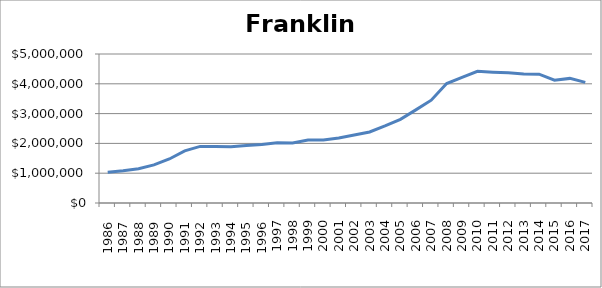
| Category | Franklin (000s) |
|---|---|
|       1986 | 1034600 |
|       1987 | 1079500 |
|       1988 | 1147600 |
|       1989 | 1278150 |
|       1990 | 1476950 |
|       1991 | 1749200 |
|       1992 | 1899600 |
|       1993 | 1900000 |
|       1994 | 1891250 |
|       1995 | 1928450 |
|       1996 | 1966700 |
| 1997 | 2024250 |
| 1998 | 2015700 |
| 1999 | 2113250 |
| 2000 | 2111250 |
| 2001 | 2181450 |
| 2002 | 2281100 |
| 2003 | 2383250 |
| 2004 | 2584600 |
| 2005 | 2807600 |
| 2006 | 3125150 |
| 2007 | 3450650 |
| 2008 | 4007450 |
| 2009 | 4217250 |
| 2010 | 4421300 |
| 2011 | 4391200 |
| 2012 | 4369650 |
| 2013 | 4325500 |
| 2014 | 4322600 |
| 2015 | 4121200 |
| 2016 | 4181300 |
| 2017 | 4047100 |